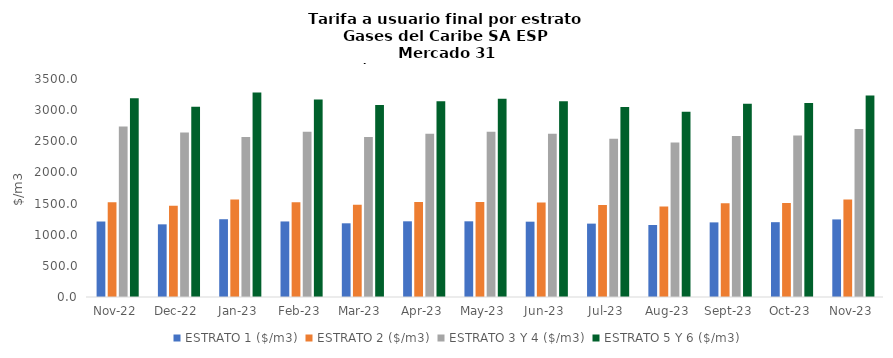
| Category | ESTRATO 1 ($/m3) | ESTRATO 2 ($/m3) | ESTRATO 3 Y 4 ($/m3) | ESTRATO 5 Y 6 ($/m3) |
|---|---|---|---|---|
| 2022-11-01 | 1212.06 | 1519.44 | 2736.03 | 3189.972 |
| 2022-12-01 | 1166.58 | 1463.43 | 2641.83 | 3053.088 |
| 2023-01-01 | 1248.7 | 1565.89 | 2568.94 | 3283.236 |
| 2023-02-01 | 1212.89 | 1521.57 | 2651.33 | 3170.196 |
| 2023-03-01 | 1183.19 | 1482.78 | 2568.94 | 3082.728 |
| 2023-04-01 | 1215.25 | 1524.46 | 2619.03 | 3142.836 |
| 2023-05-01 | 1215.25 | 1524.46 | 2651.33 | 3181.596 |
| 2023-06-01 | 1209.41 | 1517.12 | 2619.03 | 3142.836 |
| 2023-07-01 | 1178 | 1477.97 | 2542.18 | 3050.616 |
| 2023-08-01 | 1155.93 | 1451.92 | 2479.28 | 2975.136 |
| 2023-09-01 | 1198 | 1503.27 | 2586.8 | 3104.16 |
| 2023-10-01 | 1201.13 | 1507.69 | 2594.42 | 3113.304 |
| 2023-11-01 | 1245.69 | 1564.66 | 2697.24 | 3236.688 |